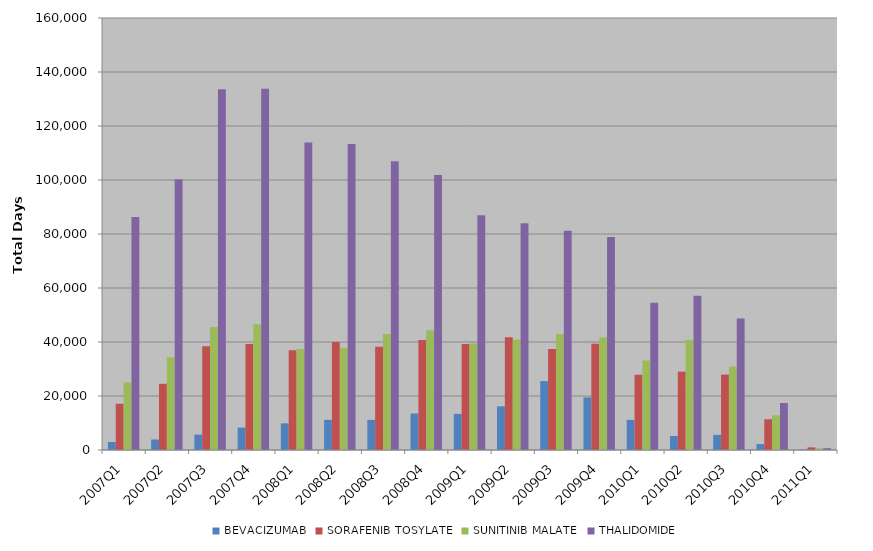
| Category | BEVACIZUMAB | SORAFENIB TOSYLATE | SUNITINIB MALATE | THALIDOMIDE |
|---|---|---|---|---|
| 2007Q1 | 2988 | 17138 | 24999 | 86323 |
| 2007Q2 | 3889 | 24518 | 34333 | 100319 |
| 2007Q3 | 5702 | 38435 | 45532 | 133636 |
| 2007Q4 | 8298 | 39247 | 46558 | 133803 |
| 2008Q1 | 9876 | 36958 | 37402 | 113874 |
| 2008Q2 | 11170 | 39984 | 37754 | 113299 |
| 2008Q3 | 11141 | 38234 | 42965 | 106939 |
| 2008Q4 | 13509 | 40754 | 44337 | 101809 |
| 2009Q1 | 13372 | 39278 | 39464 | 86909 |
| 2009Q2 | 16179 | 41749 | 40840 | 83980 |
| 2009Q3 | 25518 | 37411 | 42992 | 81184 |
| 2009Q4 | 19486 | 39338 | 41633 | 78929 |
| 2010Q1 | 11161 | 27861 | 33135 | 54545 |
| 2010Q2 | 5189 | 29016 | 40856 | 57162 |
| 2010Q3 | 5608 | 27935 | 30892 | 48665 |
| 2010Q4 | 2173 | 11392 | 12875 | 17405 |
| 2011Q1 | 168 | 975 | 654 | 672 |